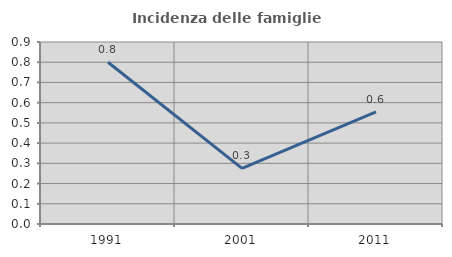
| Category | Incidenza delle famiglie numerose |
|---|---|
| 1991.0 | 0.8 |
| 2001.0 | 0.275 |
| 2011.0 | 0.554 |